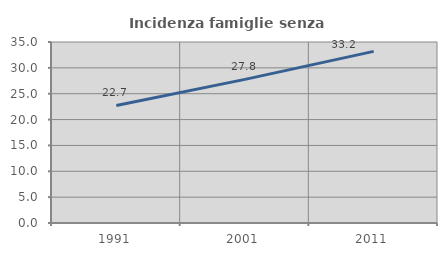
| Category | Incidenza famiglie senza nuclei |
|---|---|
| 1991.0 | 22.722 |
| 2001.0 | 27.773 |
| 2011.0 | 33.188 |